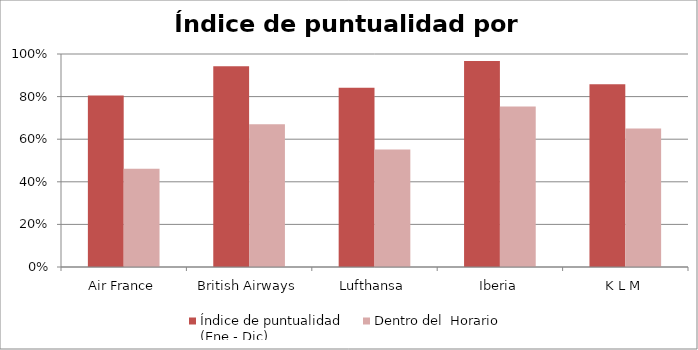
| Category | Índice de puntualidad
(Ene - Dic) | Dentro del  Horario |
|---|---|---|
| Air France | 0.805 | 0.462 |
| British Airways | 0.942 | 0.67 |
| Lufthansa | 0.842 | 0.552 |
| Iberia | 0.967 | 0.753 |
| K L M | 0.858 | 0.65 |